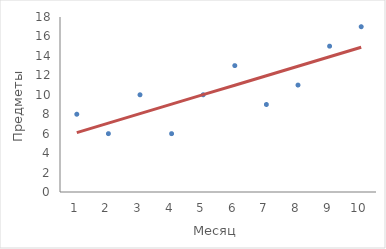
| Category | Предметов
фактическое | Предметов
ожидаемое |
|---|---|---|
| 1.0 | 8 | 6.106 |
| 2.0 | 6 | 7.082 |
| 3.0 | 10 | 8.058 |
| 4.0 | 6 | 9.034 |
| 5.0 | 10 | 10.01 |
| 6.0 | 13 | 10.986 |
| 7.0 | 9 | 11.962 |
| 8.0 | 11 | 12.938 |
| 9.0 | 15 | 13.914 |
| 10.0 | 17 | 14.89 |